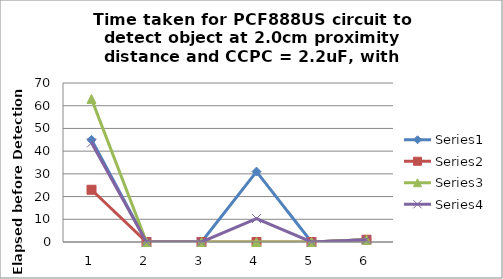
| Category | Series 0 | Series 1 | Series 2 | Series 3 |
|---|---|---|---|---|
| 0 | 45 | 23 | 63 | 43.667 |
| 1 | 0 | 0 | 0 | 0 |
| 2 | 0 | 0 | 0 | 0 |
| 3 | 31 | 0 | 0 | 10.333 |
| 4 | 0 | 0 | 0 | 0 |
| 5 | 1 | 1 | 1 | 1 |